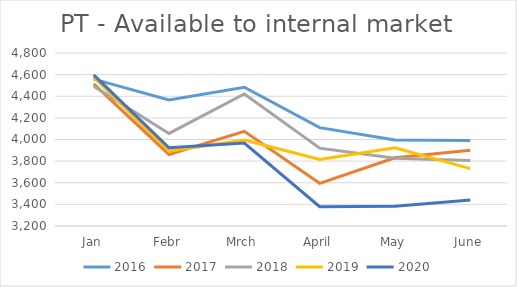
| Category | 2016 | 2017 | 2018 | 2019 | 2020 |
|---|---|---|---|---|---|
| Jan | 4558 | 4514.483 | 4493 | 4577 | 4598.04 |
| Febr | 4366 | 3861.736 | 4056 | 3893 | 3923.786 |
| Mrch | 4483 | 4075.055 | 4421 | 3996 | 3967.544 |
| April | 4110 | 3594.788 | 3920 | 3815 | 3378.312 |
| May | 3995 | 3831.206 | 3827 | 3922.928 | 3383.122 |
| June | 3990 | 3899.895 | 3805 | 3731.036 | 3440 |